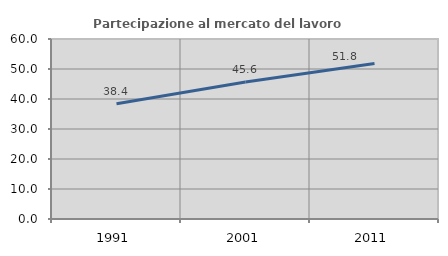
| Category | Partecipazione al mercato del lavoro  femminile |
|---|---|
| 1991.0 | 38.427 |
| 2001.0 | 45.636 |
| 2011.0 | 51.811 |